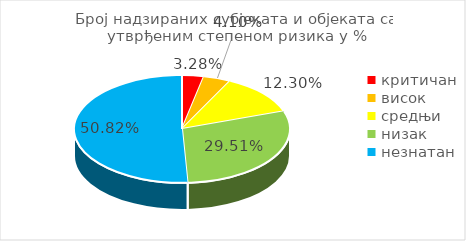
| Category | Series 0 |
|---|---|
| критичан | 0.033 |
| висок | 0.041 |
| средњи | 0.123 |
| низак | 0.295 |
| незнатан | 0.508 |